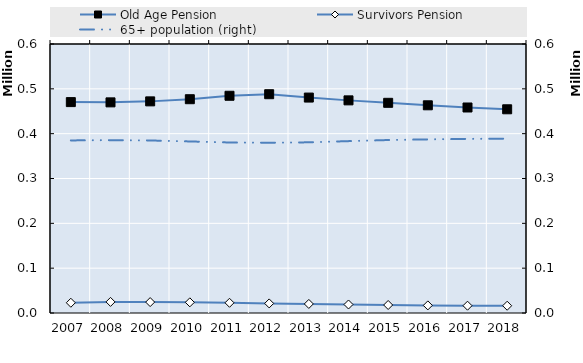
| Category | Old Age Pension | Survivors Pension |
|---|---|---|
| 2007.0 | 470397.25 | 22849 |
| 2008.0 | 469820 | 24768 |
| 2009.0 | 472027 | 24343 |
| 2010.0 | 476837 | 23802 |
| 2011.0 | 484510 | 22784 |
| 2012.0 | 488014 | 21391 |
| 2013.0 | 480521 | 20238 |
| 2014.0 | 474261 | 18973 |
| 2015.0 | 468794 | 17852 |
| 2016.0 | 463270 | 16962 |
| 2017.0 | 458372 | 16305 |
| 2018.0 | 454370 | 16202 |